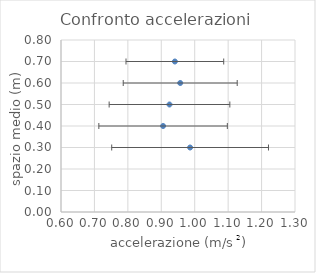
| Category | Series 0 |
|---|---|
| 0.9861932938856018 | 0.3 |
| 0.905387052965143 | 0.4 |
| 0.9245562130177514 | 0.5 |
| 0.9566326530612247 | 0.6 |
| 0.940607363611932 | 0.7 |